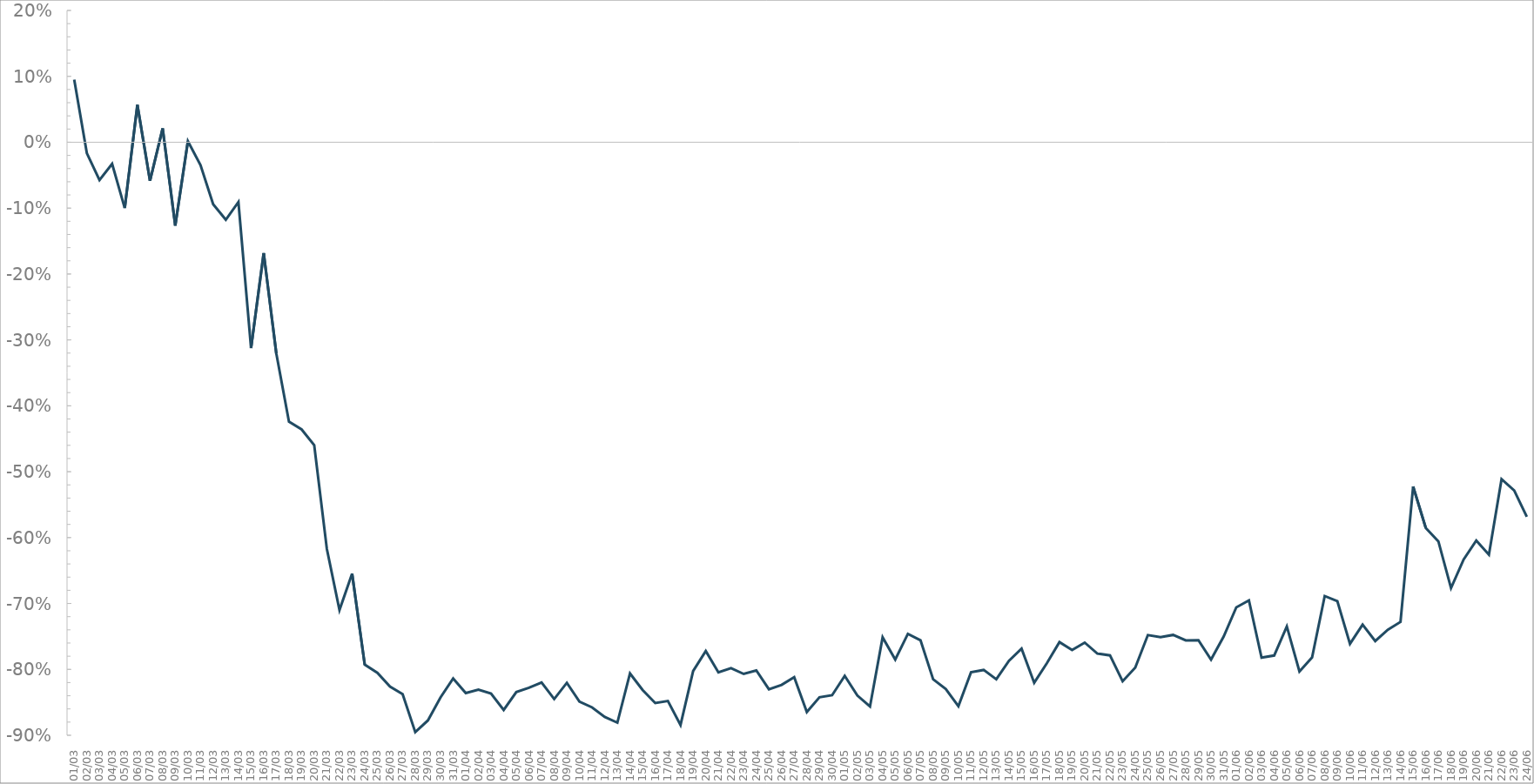
| Category | Series 0 |
|---|---|
| 2020-03-01 | 0.095 |
| 2020-03-02 | -0.017 |
| 2020-03-03 | -0.058 |
| 2020-03-04 | -0.033 |
| 2020-03-05 | -0.1 |
| 2020-03-06 | 0.057 |
| 2020-03-07 | -0.058 |
| 2020-03-08 | 0.021 |
| 2020-03-09 | -0.126 |
| 2020-03-10 | 0.001 |
| 2020-03-11 | -0.035 |
| 2020-03-12 | -0.094 |
| 2020-03-13 | -0.118 |
| 2020-03-14 | -0.091 |
| 2020-03-15 | -0.312 |
| 2020-03-16 | -0.168 |
| 2020-03-17 | -0.321 |
| 2020-03-18 | -0.424 |
| 2020-03-19 | -0.436 |
| 2020-03-20 | -0.46 |
| 2020-03-21 | -0.617 |
| 2020-03-22 | -0.71 |
| 2020-03-23 | -0.655 |
| 2020-03-24 | -0.793 |
| 2020-03-25 | -0.805 |
| 2020-03-26 | -0.826 |
| 2020-03-27 | -0.838 |
| 2020-03-28 | -0.895 |
| 2020-03-29 | -0.878 |
| 2020-03-30 | -0.843 |
| 2020-03-31 | -0.814 |
| 2020-04-01 | -0.836 |
| 2020-04-02 | -0.831 |
| 2020-04-03 | -0.837 |
| 2020-04-04 | -0.862 |
| 2020-04-05 | -0.834 |
| 2020-04-06 | -0.828 |
| 2020-04-07 | -0.82 |
| 2020-04-08 | -0.845 |
| 2020-04-09 | -0.82 |
| 2020-04-10 | -0.849 |
| 2020-04-11 | -0.858 |
| 2020-04-12 | -0.872 |
| 2020-04-13 | -0.881 |
| 2020-04-14 | -0.806 |
| 2020-04-15 | -0.831 |
| 2020-04-16 | -0.851 |
| 2020-04-17 | -0.848 |
| 2020-04-18 | -0.884 |
| 2020-04-19 | -0.802 |
| 2020-04-20 | -0.772 |
| 2020-04-21 | -0.805 |
| 2020-04-22 | -0.798 |
| 2020-04-23 | -0.807 |
| 2020-04-24 | -0.802 |
| 2020-04-25 | -0.83 |
| 2020-04-26 | -0.823 |
| 2020-04-27 | -0.812 |
| 2020-04-28 | -0.865 |
| 2020-04-29 | -0.842 |
| 2020-04-30 | -0.839 |
| 2020-05-01 | -0.81 |
| 2020-05-02 | -0.84 |
| 2020-05-03 | -0.856 |
| 2020-05-04 | -0.751 |
| 2020-05-05 | -0.785 |
| 2020-05-06 | -0.746 |
| 2020-05-07 | -0.756 |
| 2020-05-08 | -0.815 |
| 2020-05-09 | -0.83 |
| 2020-05-10 | -0.856 |
| 2020-05-11 | -0.804 |
| 2020-05-12 | -0.801 |
| 2020-05-13 | -0.815 |
| 2020-05-14 | -0.787 |
| 2020-05-15 | -0.769 |
| 2020-05-16 | -0.82 |
| 2020-05-17 | -0.791 |
| 2020-05-18 | -0.759 |
| 2020-05-19 | -0.771 |
| 2020-05-20 | -0.759 |
| 2020-05-21 | -0.776 |
| 2020-05-22 | -0.779 |
| 2020-05-23 | -0.818 |
| 2020-05-24 | -0.797 |
| 2020-05-25 | -0.748 |
| 2020-05-26 | -0.751 |
| 2020-05-27 | -0.748 |
| 2020-05-28 | -0.756 |
| 2020-05-29 | -0.756 |
| 2020-05-30 | -0.785 |
| 2020-05-31 | -0.75 |
| 2020-06-01 | -0.706 |
| 2020-06-02 | -0.695 |
| 2020-06-03 | -0.782 |
| 2020-06-04 | -0.779 |
| 2020-06-05 | -0.735 |
| 2020-06-06 | -0.803 |
| 2020-06-07 | -0.782 |
| 2020-06-08 | -0.689 |
| 2020-06-09 | -0.696 |
| 2020-06-10 | -0.761 |
| 2020-06-11 | -0.732 |
| 2020-06-12 | -0.757 |
| 2020-06-13 | -0.74 |
| 2020-06-14 | -0.728 |
| 2020-06-15 | -0.523 |
| 2020-06-16 | -0.585 |
| 2020-06-17 | -0.606 |
| 2020-06-18 | -0.677 |
| 2020-06-19 | -0.633 |
| 2020-06-20 | -0.604 |
| 2020-06-21 | -0.626 |
| 2020-06-22 | -0.511 |
| 2020-06-23 | -0.528 |
| 2020-06-24 | -0.568 |